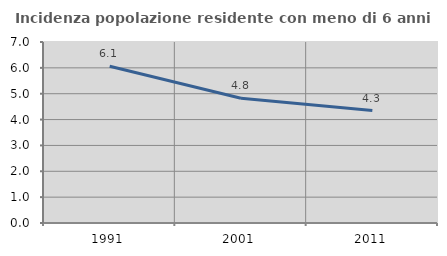
| Category | Incidenza popolazione residente con meno di 6 anni |
|---|---|
| 1991.0 | 6.064 |
| 2001.0 | 4.824 |
| 2011.0 | 4.348 |